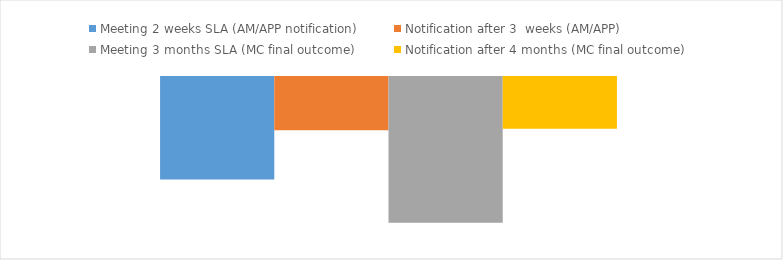
| Category | Meeting 2 weeks SLA (AM/APP notification) | Notification after 3  weeks (AM/APP) | Meeting 3 months SLA (MC final outcome) | Notification after 4 months (MC final outcome)  |
|---|---|---|---|---|
| 0 | -0.155 | -0.08 | -0.22 | -0.078 |